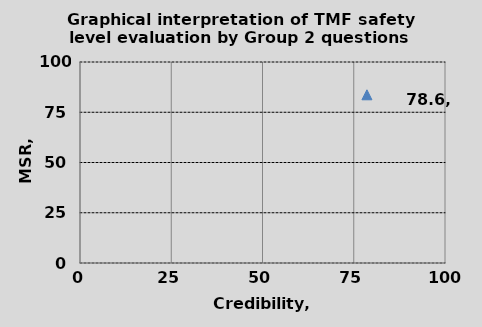
| Category | B2 |
|---|---|
| 78.6096256684492 | 83.685 |